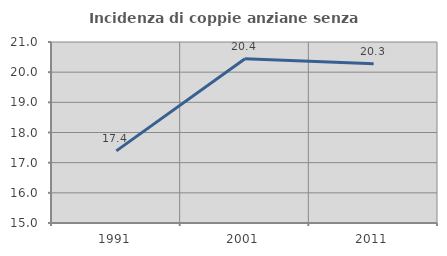
| Category | Incidenza di coppie anziane senza figli  |
|---|---|
| 1991.0 | 17.391 |
| 2001.0 | 20.442 |
| 2011.0 | 20.281 |